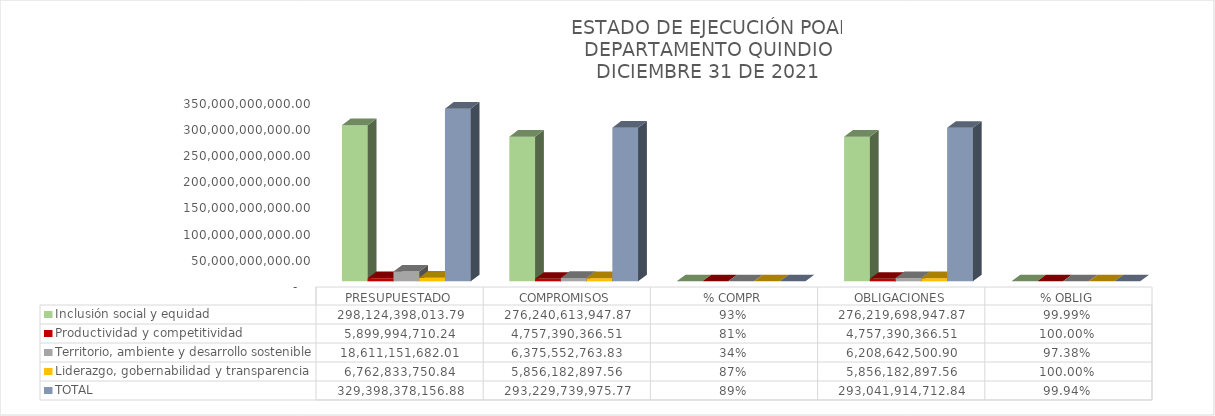
| Category | Inclusión social y equidad | Productividad y competitividad | Territorio, ambiente y desarrollo sostenible | Liderazgo, gobernabilidad y transparencia | TOTAL |
|---|---|---|---|---|---|
| PRESUPUESTADO | 298124398013.79 | 5899994710.24 | 18611151682.01 | 6762833750.84 | 329398378156.88 |
| COMPROMISOS | 276240613947.87 | 4757390366.51 | 6375552763.834 | 5856182897.56 | 293229739975.774 |
| % COMPR | 0.927 | 0.806 | 0.343 | 0.866 | 0.89 |
| OBLIGACIONES | 276219698947.87 | 4757390366.51 | 6208642500.903 | 5856182897.56 | 293041914712.843 |
| % OBLIG | 1 | 1 | 0.974 | 1 | 0.999 |